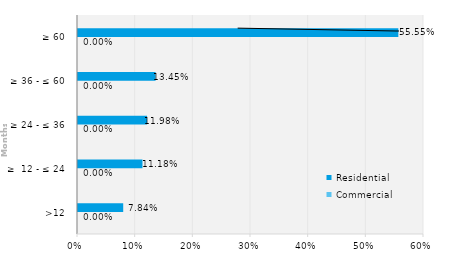
| Category | Commercial | Residential |
|---|---|---|
| >12 | 0 | 0.078 |
| ≥  12 - ≤ 24 | 0 | 0.112 |
| ≥ 24 - ≤ 36 | 0 | 0.12 |
| ≥ 36 - ≤ 60 | 0 | 0.135 |
| ≥ 60 | 0 | 0.555 |